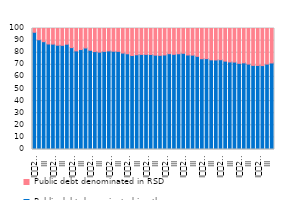
| Category | Public debt denominated in other currencies | Public debt denominated in RSD  |
|---|---|---|
| I
2009 | 96.9 | 3.1 |
| II | 90.7 | 9.3 |
| III | 89.1 | 10.9 |
| IV | 87.2 | 12.8 |
| I
2010 | 87.1 | 12.9 |
| II | 86.2 | 13.8 |
| III | 86.1 | 13.9 |
| IV | 87 | 13 |
| I
2011 | 84.2 | 15.8 |
| II | 81.5 | 18.5 |
| III | 82.6 | 17.4 |
| IV | 83.9 | 16.1 |
| I
2012 | 82 | 18 |
| II | 80.9 | 19.1 |
| III | 80.5 | 19.5 |
| IV | 81.1 | 18.9 |
| I
2013 | 81.5 | 18.5 |
| II | 81.2 | 18.8 |
| III | 81.1 | 18.9 |
| IV | 79.7 | 20.3 |
| I
2014 | 79.1 | 20.9 |
| II | 77.7 | 22.3 |
| III | 78.3 | 21.7 |
| IV | 78.6 | 21.4 |
| I
2015 | 78.6 | 21.4 |
| II | 78.5 | 21.5 |
| III | 78 | 22 |
| IV | 77.8 | 22.2 |
| I
2016 | 78.138 | 21.862 |
| II | 79.184 | 20.816 |
| III | 78.654 | 21.346 |
| IV | 79.122 | 20.877 |
| I
2017 | 79.5 | 20.5 |
| II | 78.1 | 21.9 |
| III | 78 | 22 |
| IV | 77 | 23 |
| I
2018 | 75 | 25 |
| II | 75.1 | 24.9 |
| III | 74.1 | 25.9 |
| IV | 74 | 26 |
| I
2019 | 74.188 | 25.812 |
| II | 73.033 | 26.967 |
| III | 72.361 | 27.639 |
| IV | 72.253 | 27.747 |
| I
2020 | 71.2 | 28.8 |
| II | 71.6 | 28.4 |
| III | 70.6 | 29.4 |
| IV | 69.5 | 30.5 |
| I
2021 | 69.475 | 30.525 |
| II | 69.359 | 30.641 |
| III | 70.572 | 29.428 |
| IV | 71.5 | 28.5 |